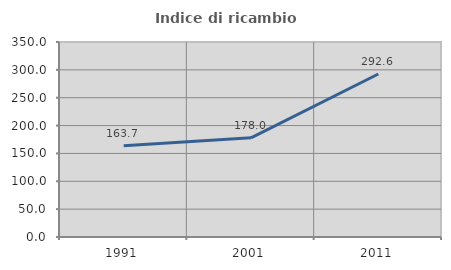
| Category | Indice di ricambio occupazionale  |
|---|---|
| 1991.0 | 163.736 |
| 2001.0 | 178.017 |
| 2011.0 | 292.553 |